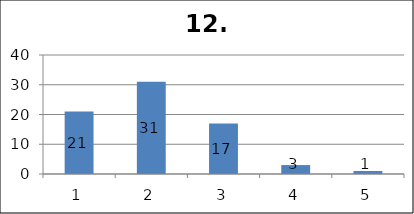
| Category | Series 1 |
|---|---|
| 0 | 21 |
| 1 | 31 |
| 2 | 17 |
| 3 | 3 |
| 4 | 1 |